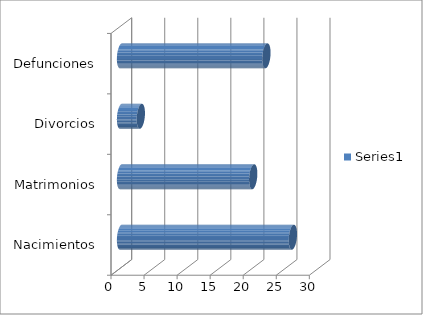
| Category | Series 0 |
|---|---|
| Nacimientos | 26 |
| Matrimonios | 20 |
| Divorcios | 3 |
| Defunciones | 22 |